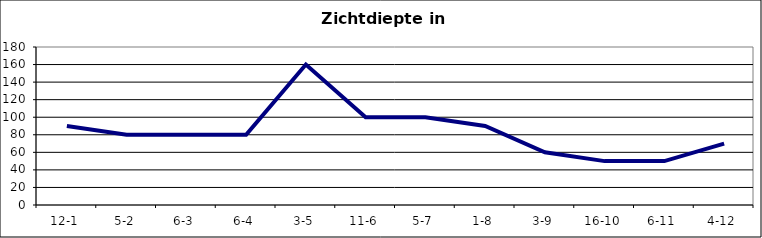
| Category | Zichtdiepte in cm |
|---|---|
| 12-1 | 90 |
| 5-2 | 80 |
| 6-3 | 80 |
| 6-4 | 80 |
| 3-5 | 160 |
| 11-6 | 100 |
| 5-7 | 100 |
| 1-8 | 90 |
| 3-9 | 60 |
| 16-10 | 50 |
| 6-11 | 50 |
| 4-12 | 70 |